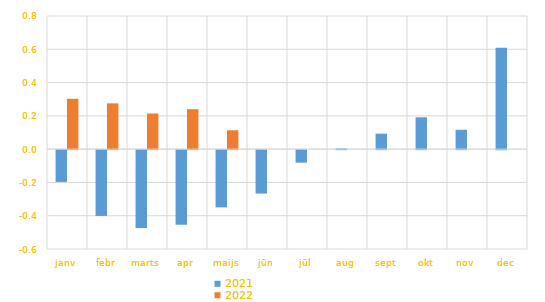
| Category | 2021 | 2022 |
|---|---|---|
| janv | -0.191 | 0.302 |
| febr | -0.395 | 0.275 |
| marts | -0.468 | 0.214 |
| apr | -0.448 | 0.24 |
| maijs | -0.344 | 0.114 |
| jūn | -0.261 | 0 |
| jūl | -0.075 | 0 |
| aug | 0.004 | 0 |
| sept | 0.093 | 0 |
| okt | 0.191 | 0 |
| nov | 0.116 | 0 |
| dec | 0.609 | 0 |